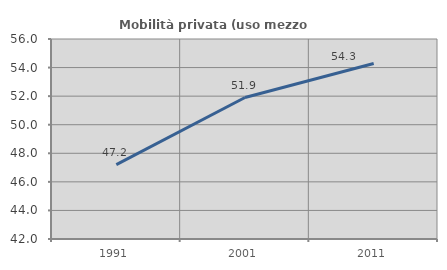
| Category | Mobilità privata (uso mezzo privato) |
|---|---|
| 1991.0 | 47.203 |
| 2001.0 | 51.904 |
| 2011.0 | 54.283 |